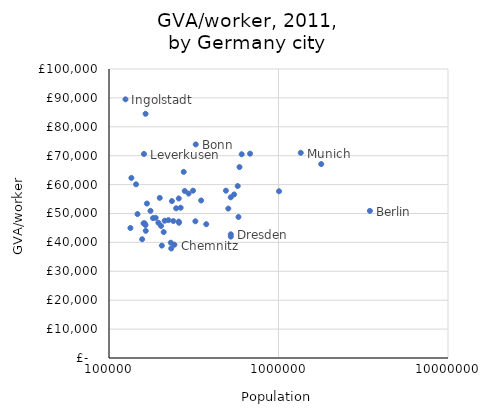
| Category | Population 2011 |
|---|---|
| 125088.0 | 89500 |
| 164351.0 | 84500 |
| 324899.0 | 73900 |
| 1353186.0 | 71000 |
| 679664.0 | 70700 |
| 160772.0 | 70600 |
| 606588.0 | 70500 |
| 1786448.0 | 67100 |
| 588735.0 | 66064.28 |
| 275976.0 | 64400 |
| 135520.0 | 62300 |
| 144402.0 | 60100 |
| 574635.0 | 59500 |
| 489559.0 | 57900 |
| 313174.0 | 57900 |
| 279803.0 | 57784.2 |
| 1007119.0 | 57700 |
| 294761.0 | 56900 |
| 547340.0 | 56600 |
| 522686.0 | 55600 |
| 199237.0 | 55400 |
| 257981.0 | 55200 |
| 349721.0 | 54500 |
| 235076.0 | 54300 |
| 167344.0 | 53443.74 |
| 264708.0 | 52000 |
| 248867.0 | 51800 |
| 505664.0 | 51700 |
| 175741.0 | 50920.14 |
| 3460725.0 | 50900 |
| 147312.0 | 49800 |
| 580444.0 | 48800 |
| 188529.0 | 48500 |
| 181783.0 | 48400 |
| 224191.0 | 47700 |
| 212945.0 | 47500 |
| 239526.0 | 47400 |
| 323270.0 | 47300 |
| 257993.0 | 47201.91 |
| 258664.0 | 46800 |
| 195530.0 | 46800 |
| 162173.0 | 46600 |
| 159927.0 | 46600 |
| 374737.0 | 46300 |
| 164119.0 | 46011.34 |
| 202735.0 | 45700 |
| 133799.0 | 44982.57 |
| 164762.0 | 44000 |
| 210232.0 | 43580.16 |
| 523058.0 | 42800 |
| 522883.0 | 42000 |
| 156906.0 | 41100 |
| 231525.0 | 39900 |
| 243248.0 | 39200 |
| 204994.0 | 38900 |
| 232963.0 | 37900 |